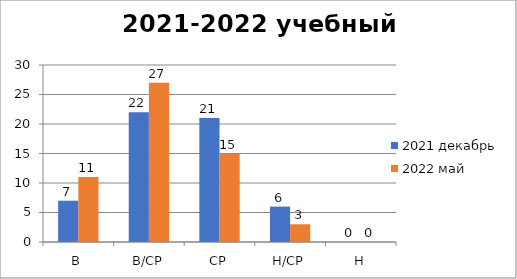
| Category | 2021 декабрь | 2022 май |
|---|---|---|
| В | 7 | 11 |
| В/СР | 22 | 27 |
| СР | 21 | 15 |
| Н/СР | 6 | 3 |
| Н | 0 | 0 |